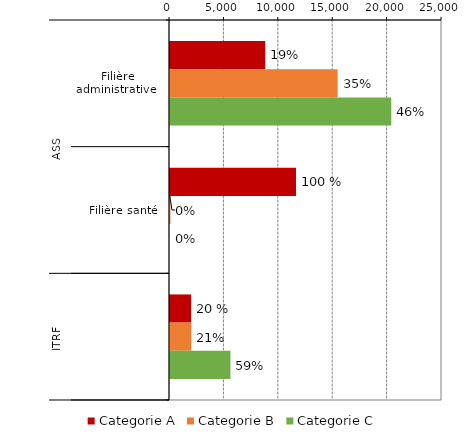
| Category | Categorie A | Categorie B | Categorie C |
|---|---|---|---|
| 0 | 8755 | 15409 | 20338 |
| 1 | 11583 | 40 | 0 |
| 2 | 1945 | 1961 | 5556 |